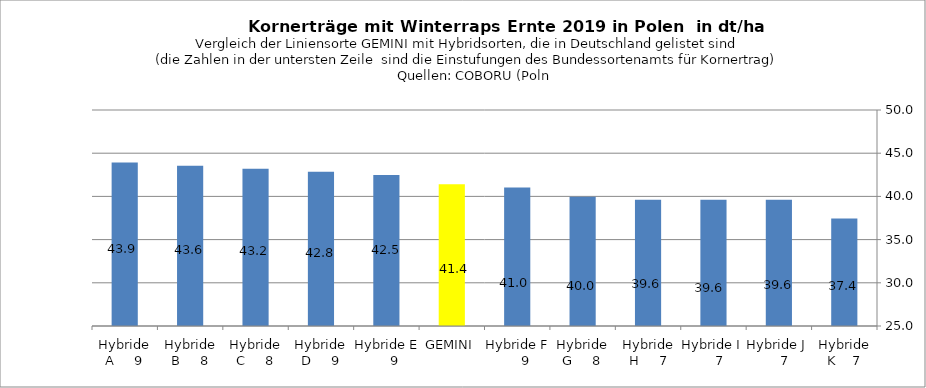
| Category | dt/ha |
|---|---|
| Hybride K    7 | 37.44 |
| Hybride J     7 | 39.6 |
| Hybride I     7 | 39.6 |
| Hybride H     7 | 39.6 |
| Hybride G     8 | 39.96 |
| Hybride F     9 | 41.04 |
| GEMINI | 41.4 |
| Hybride E     9 | 42.48 |
| Hybride D     9 | 42.84 |
| Hybride C     8 | 43.2 |
| Hybride B     8 | 43.56 |
| Hybride A     9 | 43.92 |